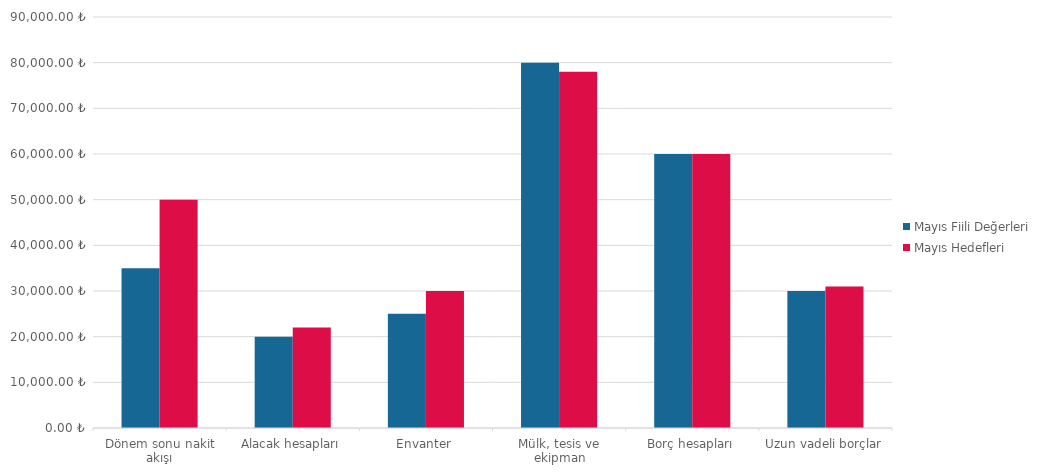
| Category | Mayıs Fiili Değerleri | Mayıs Hedefleri |
|---|---|---|
| Dönem sonu nakit akışı | 35000 | 50000 |
| Alacak hesapları | 20000 | 22000 |
| Envanter | 25000 | 30000 |
| Mülk, tesis ve ekipman | 80000 | 78000 |
| Borç hesapları | 60000 | 60000 |
| Uzun vadeli borçlar | 30000 | 31000 |